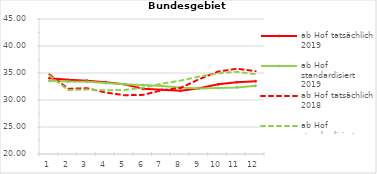
| Category | ab Hof tatsächlich 2019 | ab Hof standardisiert 2019 | ab Hof tatsächlich 2018 | ab Hof standardisiert 2018 |
|---|---|---|---|---|
| 0 | 34.037 | 33.563 | 34.739 | 34.547 |
| 1 | 33.754 | 33.42 | 32.09 | 31.839 |
| 2 | 33.588 | 33.357 | 32.188 | 31.93 |
| 3 | 33.308 | 33.126 | 31.392 | 31.808 |
| 4 | 32.902 | 32.918 | 30.885 | 31.857 |
| 5 | 32.066 | 32.776 | 30.95 | 32.283 |
| 6 | 31.899 | 32.61 | 31.8 | 33.031 |
| 7 | 31.709 | 32.306 | 32.243 | 33.591 |
| 8 | 32.177 | 32.116 | 33.873 | 34.351 |
| 9 | 32.896 | 32.209 | 35.264 | 34.95 |
| 10 | 33.288 | 32.336 | 35.789 | 35.232 |
| 11 | 33.473 | 32.62 | 35.338 | 34.772 |